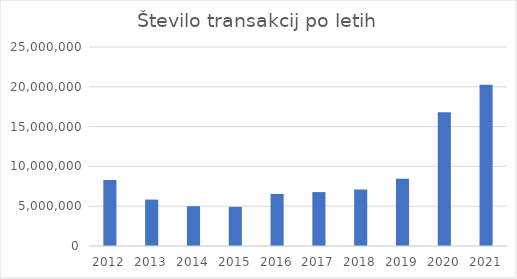
| Category | Series 0 |
|---|---|
| 2012.0 | 8296609 |
| 2013.0 | 5831890 |
| 2014.0 | 4994779 |
| 2015.0 | 4916123 |
| 2016.0 | 6541682 |
| 2017.0 | 6776234 |
| 2018.0 | 7098976 |
| 2019.0 | 8440383 |
| 2020.0 | 16796574 |
| 2021.0 | 20266490 |